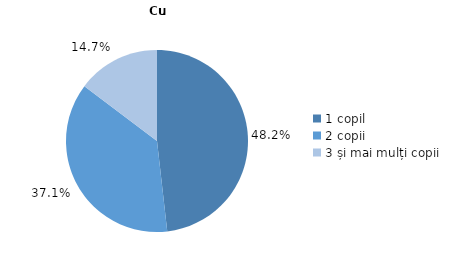
| Category | Cu migranți |
|---|---|
| 1 copil | 48.2 |
| 2 copii | 37.1 |
| 3 și mai mulți copii | 14.7 |